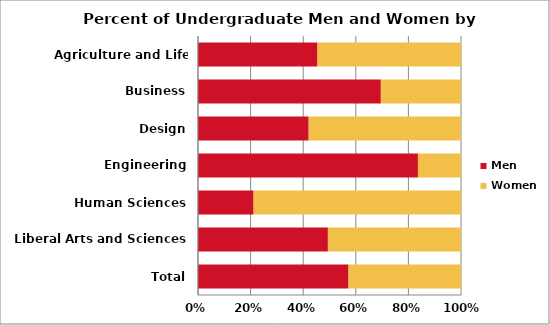
| Category | Men | Women |
|---|---|---|
| Agriculture and Life Sciences | 1894 | 2275 |
| Business | 3118 | 1367 |
| Design | 733 | 1009 |
| Engineering | 6354 | 1244 |
| Human Sciences | 741 | 2764 |
| Liberal Arts and Sciences | 3356 | 3439 |
| Total | 16196 | 12098 |